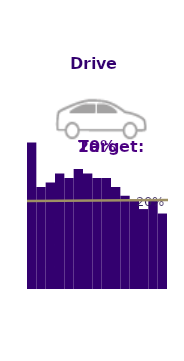
| Category | Drive Alone |
|---|---|
| 1989.0 | 33 |
| 1992.0 | 23 |
| 1994.0 | 24 |
| 1996.0 | 26 |
| 1998.0 | 25 |
| 2000.0 | 27 |
| 2002.0 | 26 |
| 2004.0 | 25 |
| 2006.0 | 25 |
| 2008.0 | 23 |
| 2010.0 | 21 |
| 2012.0 | 20 |
| 2014.0 | 18 |
| 2015.0 | 20 |
| 2016.0 | 17 |